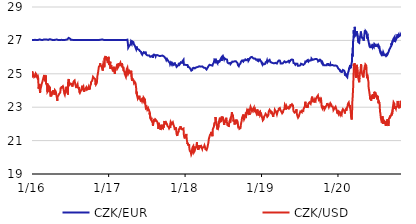
| Category | CZK/EUR | CZK/USD |
|---|---|---|
| 2016-01-04 | 27.02 | 24.794 |
| 2016-01-05 | 27.02 | 25.145 |
| 2016-01-06 | 27.025 | 25.196 |
| 2016-01-07 | 27.03 | 24.873 |
| 2016-01-08 | 27.02 | 24.873 |
| 2016-01-11 | 27.02 | 24.815 |
| 2016-01-12 | 27.02 | 24.937 |
| 2016-01-13 | 27.02 | 24.983 |
| 2016-01-14 | 27.02 | 24.804 |
| 2016-01-15 | 27.02 | 24.756 |
| 2016-01-18 | 27.035 | 24.821 |
| 2016-01-19 | 27.025 | 24.865 |
| 2016-01-20 | 27.04 | 24.789 |
| 2016-01-21 | 27.065 | 24.844 |
| 2016-01-22 | 27.025 | 25.002 |
| 2016-01-25 | 27.02 | 24.98 |
| 2016-01-26 | 27.02 | 24.928 |
| 2016-01-27 | 27.025 | 24.82 |
| 2016-01-28 | 27.02 | 24.78 |
| 2016-01-29 | 27.025 | 24.76 |
| 2016-02-01 | 27.02 | 24.823 |
| 2016-02-02 | 27.025 | 24.748 |
| 2016-02-03 | 27.02 | 24.72 |
| 2016-02-04 | 27.02 | 24.11 |
| 2016-02-05 | 27.035 | 24.134 |
| 2016-02-08 | 27.06 | 24.379 |
| 2016-02-09 | 27.06 | 24.09 |
| 2016-02-10 | 27.03 | 24.006 |
| 2016-02-11 | 27.07 | 23.857 |
| 2016-02-12 | 27.065 | 24.004 |
| 2016-02-15 | 27.035 | 24.182 |
| 2016-02-16 | 27.03 | 24.214 |
| 2016-02-17 | 27.03 | 24.276 |
| 2016-02-18 | 27.02 | 24.375 |
| 2016-02-19 | 27.025 | 24.351 |
| 2016-02-22 | 27.02 | 24.505 |
| 2016-02-23 | 27.03 | 24.57 |
| 2016-02-24 | 27.045 | 24.629 |
| 2016-02-25 | 27.05 | 24.526 |
| 2016-02-26 | 27.065 | 24.589 |
| 2016-02-29 | 27.055 | 24.848 |
| 2016-03-01 | 27.055 | 24.879 |
| 2016-03-02 | 27.045 | 24.933 |
| 2016-03-03 | 27.055 | 24.819 |
| 2016-03-04 | 27.06 | 24.661 |
| 2016-03-07 | 27.055 | 24.692 |
| 2016-03-08 | 27.06 | 24.541 |
| 2016-03-09 | 27.045 | 24.64 |
| 2016-03-10 | 27.035 | 24.899 |
| 2016-03-11 | 27.06 | 24.398 |
| 2016-03-14 | 27.05 | 24.324 |
| 2016-03-15 | 27.045 | 24.347 |
| 2016-03-16 | 27.05 | 24.45 |
| 2016-03-17 | 27.045 | 23.908 |
| 2016-03-18 | 27.035 | 23.966 |
| 2016-03-21 | 27.03 | 23.98 |
| 2016-03-22 | 27.035 | 24.117 |
| 2016-03-23 | 27.035 | 24.201 |
| 2016-03-24 | 27.065 | 24.267 |
| 2016-03-29 | 27.075 | 24.183 |
| 2016-03-30 | 27.075 | 23.896 |
| 2016-03-31 | 27.055 | 23.757 |
| 2016-04-01 | 27.03 | 23.64 |
| 2016-04-04 | 27.05 | 23.766 |
| 2016-04-05 | 27.035 | 23.774 |
| 2016-04-06 | 27.03 | 23.834 |
| 2016-04-07 | 27.025 | 23.775 |
| 2016-04-08 | 27.02 | 23.771 |
| 2016-04-11 | 27.025 | 23.724 |
| 2016-04-12 | 27.03 | 23.717 |
| 2016-04-13 | 27.035 | 23.923 |
| 2016-04-14 | 27.03 | 24.018 |
| 2016-04-15 | 27.025 | 23.948 |
| 2016-04-18 | 27.02 | 23.889 |
| 2016-04-19 | 27.02 | 23.821 |
| 2016-04-20 | 27.02 | 23.743 |
| 2016-04-21 | 27.025 | 23.798 |
| 2016-04-22 | 27.045 | 24.014 |
| 2016-04-25 | 27.045 | 24.014 |
| 2016-04-26 | 27.025 | 23.946 |
| 2016-04-27 | 27.035 | 23.916 |
| 2016-04-28 | 27.045 | 23.811 |
| 2016-04-29 | 27.04 | 23.714 |
| 2016-05-02 | 27.05 | 23.534 |
| 2016-05-03 | 27.035 | 23.383 |
| 2016-05-04 | 27.03 | 23.457 |
| 2016-05-05 | 27.03 | 23.628 |
| 2016-05-06 | 27.02 | 23.654 |
| 2016-05-09 | 27.02 | 23.717 |
| 2016-05-10 | 27.025 | 23.762 |
| 2016-05-11 | 27.02 | 23.681 |
| 2016-05-12 | 27.025 | 23.729 |
| 2016-05-13 | 27.02 | 23.81 |
| 2016-05-16 | 27.02 | 23.859 |
| 2016-05-17 | 27.02 | 23.873 |
| 2016-05-18 | 27.02 | 23.955 |
| 2016-05-19 | 27.02 | 24.133 |
| 2016-05-20 | 27.025 | 24.083 |
| 2016-05-23 | 27.035 | 24.106 |
| 2016-05-24 | 27.025 | 24.192 |
| 2016-05-25 | 27.03 | 24.253 |
| 2016-05-26 | 27.025 | 24.192 |
| 2016-05-27 | 27.03 | 24.203 |
| 2016-05-30 | 27.02 | 24.255 |
| 2016-05-31 | 27.02 | 24.223 |
| 2016-06-01 | 27.025 | 24.186 |
| 2016-06-02 | 27.03 | 24.167 |
| 2016-06-03 | 27.025 | 24.221 |
| 2016-06-06 | 27.025 | 23.805 |
| 2016-06-07 | 27.02 | 23.815 |
| 2016-06-08 | 27.02 | 23.743 |
| 2016-06-09 | 27.02 | 23.815 |
| 2016-06-10 | 27.025 | 23.905 |
| 2016-06-13 | 27.035 | 23.997 |
| 2016-06-14 | 27.045 | 24.088 |
| 2016-06-15 | 27.075 | 24.103 |
| 2016-06-16 | 27.065 | 24.224 |
| 2016-06-17 | 27.07 | 24.052 |
| 2016-06-20 | 27.06 | 23.877 |
| 2016-06-21 | 27.065 | 23.923 |
| 2016-06-22 | 27.07 | 23.976 |
| 2016-06-23 | 27.06 | 23.761 |
| 2016-06-24 | 27.1 | 24.491 |
| 2016-06-27 | 27.15 | 24.692 |
| 2016-06-28 | 27.11 | 24.484 |
| 2016-06-29 | 27.115 | 24.443 |
| 2016-06-30 | 27.13 | 24.433 |
| 2016-07-01 | 27.095 | 24.335 |
| 2016-07-04 | 27.095 | 24.322 |
| 2016-07-07 | 27.05 | 24.417 |
| 2016-07-08 | 27.03 | 24.421 |
| 2016-07-11 | 27.035 | 24.458 |
| 2016-07-12 | 27.035 | 24.367 |
| 2016-07-13 | 27.035 | 24.415 |
| 2016-07-14 | 27.04 | 24.235 |
| 2016-07-15 | 27.03 | 24.284 |
| 2016-07-18 | 27.025 | 24.446 |
| 2016-07-19 | 27.025 | 24.488 |
| 2016-07-20 | 27.02 | 24.532 |
| 2016-07-21 | 27.025 | 24.53 |
| 2016-07-22 | 27.025 | 24.535 |
| 2016-07-25 | 27.02 | 24.601 |
| 2016-07-26 | 27.025 | 24.573 |
| 2016-07-27 | 27.035 | 24.594 |
| 2016-07-28 | 27.045 | 24.382 |
| 2016-07-29 | 27.03 | 24.324 |
| 2016-08-01 | 27.03 | 24.212 |
| 2016-08-02 | 27.03 | 24.147 |
| 2016-08-03 | 27.035 | 24.143 |
| 2016-08-04 | 27.03 | 24.273 |
| 2016-08-05 | 27.02 | 24.219 |
| 2016-08-08 | 27.03 | 24.38 |
| 2016-08-09 | 27.025 | 24.392 |
| 2016-08-10 | 27.025 | 24.17 |
| 2016-08-11 | 27.02 | 24.224 |
| 2016-08-12 | 27.02 | 24.211 |
| 2016-08-15 | 27.02 | 24.162 |
| 2016-08-16 | 27.02 | 23.918 |
| 2016-08-17 | 27.025 | 23.973 |
| 2016-08-18 | 27.025 | 23.865 |
| 2016-08-19 | 27.02 | 23.851 |
| 2016-08-22 | 27.025 | 23.901 |
| 2016-08-23 | 27.025 | 23.832 |
| 2016-08-24 | 27.025 | 23.984 |
| 2016-08-25 | 27.03 | 23.938 |
| 2016-08-26 | 27.02 | 23.928 |
| 2016-08-29 | 27.02 | 24.192 |
| 2016-08-30 | 27.025 | 24.196 |
| 2016-08-31 | 27.03 | 24.286 |
| 2016-09-01 | 27.025 | 24.252 |
| 2016-09-02 | 27.02 | 24.138 |
| 2016-09-05 | 27.02 | 24.218 |
| 2016-09-06 | 27.02 | 24.211 |
| 2016-09-07 | 27.02 | 24.041 |
| 2016-09-08 | 27.02 | 23.921 |
| 2016-09-09 | 27.02 | 23.975 |
| 2016-09-12 | 27.025 | 24.074 |
| 2016-09-13 | 27.02 | 24.031 |
| 2016-09-14 | 27.025 | 24.083 |
| 2016-09-15 | 27.025 | 24.017 |
| 2016-09-16 | 27.025 | 24.073 |
| 2016-09-19 | 27.02 | 24.197 |
| 2016-09-20 | 27.02 | 24.16 |
| 2016-09-21 | 27.02 | 24.232 |
| 2016-09-22 | 27.02 | 24.046 |
| 2016-09-23 | 27.02 | 24.096 |
| 2016-09-26 | 27.02 | 23.992 |
| 2016-09-27 | 27.025 | 24.088 |
| 2016-09-29 | 27.02 | 24.076 |
| 2016-09-30 | 27.02 | 24.21 |
| 2016-10-03 | 27.02 | 24.049 |
| 2016-10-04 | 27.02 | 24.207 |
| 2016-10-05 | 27.02 | 24.085 |
| 2016-10-06 | 27.02 | 24.156 |
| 2016-10-07 | 27.02 | 24.249 |
| 2016-10-10 | 27.02 | 24.209 |
| 2016-10-11 | 27.02 | 24.387 |
| 2016-10-12 | 27.025 | 24.521 |
| 2016-10-13 | 27.02 | 24.478 |
| 2016-10-14 | 27.025 | 24.561 |
| 2016-10-17 | 27.025 | 24.584 |
| 2016-10-18 | 27.02 | 24.578 |
| 2016-10-19 | 27.02 | 24.611 |
| 2016-10-20 | 27.02 | 24.603 |
| 2016-10-21 | 27.02 | 24.82 |
| 2016-10-24 | 27.02 | 24.809 |
| 2016-10-25 | 27.02 | 24.846 |
| 2016-10-26 | 27.02 | 24.736 |
| 2016-10-27 | 27.02 | 24.729 |
| 2016-10-31 | 27.025 | 24.687 |
| 2016-11-01 | 27.025 | 24.508 |
| 2016-11-02 | 27.02 | 24.356 |
| 2016-11-03 | 27.02 | 24.426 |
| 2016-11-04 | 27.02 | 24.359 |
| 2016-11-07 | 27.02 | 24.424 |
| 2016-11-08 | 27.02 | 24.478 |
| 2016-11-09 | 27.025 | 24.521 |
| 2016-11-10 | 27.02 | 24.804 |
| 2016-11-11 | 27.055 | 24.802 |
| 2016-11-14 | 27.025 | 25.08 |
| 2016-11-15 | 27.03 | 25.106 |
| 2016-11-16 | 27.035 | 25.257 |
| 2016-11-18 | 27.035 | 25.436 |
| 2016-11-21 | 27.03 | 25.424 |
| 2016-11-22 | 27.045 | 25.474 |
| 2016-11-23 | 27.025 | 25.488 |
| 2016-11-24 | 27.035 | 25.629 |
| 2016-11-25 | 27.04 | 25.532 |
| 2016-11-28 | 27.045 | 25.538 |
| 2016-11-29 | 27.05 | 25.574 |
| 2016-11-30 | 27.06 | 25.455 |
| 2016-12-01 | 27.06 | 25.465 |
| 2016-12-02 | 27.06 | 25.426 |
| 2016-12-05 | 27.055 | 25.276 |
| 2016-12-06 | 27.045 | 25.191 |
| 2016-12-07 | 27.035 | 25.195 |
| 2016-12-08 | 27.04 | 25.134 |
| 2016-12-09 | 27.025 | 25.588 |
| 2016-12-12 | 27.025 | 25.511 |
| 2016-12-13 | 27.02 | 25.461 |
| 2016-12-14 | 27.025 | 25.386 |
| 2016-12-15 | 27.02 | 25.932 |
| 2016-12-16 | 27.02 | 25.882 |
| 2016-12-19 | 27.02 | 25.926 |
| 2016-12-20 | 27.02 | 26.068 |
| 2016-12-21 | 27.02 | 25.927 |
| 2016-12-22 | 27.02 | 25.869 |
| 2016-12-23 | 27.02 | 25.865 |
| 2016-12-27 | 27.02 | 25.866 |
| 2016-12-28 | 27.04 | 26 |
| 2016-12-29 | 27.02 | 25.849 |
| 2016-12-30 | 27.02 | 25.639 |
| 2017-01-02 | 27.02 | 25.819 |
| 2017-01-03 | 27.02 | 26.017 |
| 2017-01-04 | 27.02 | 25.889 |
| 2017-01-05 | 27.02 | 25.714 |
| 2017-01-06 | 27.02 | 25.516 |
| 2017-01-09 | 27.02 | 25.697 |
| 2017-01-10 | 27.02 | 25.571 |
| 2017-01-11 | 27.02 | 25.721 |
| 2017-01-12 | 27.02 | 25.3 |
| 2017-01-13 | 27.02 | 25.347 |
| 2017-01-16 | 27.02 | 25.503 |
| 2017-01-17 | 27.02 | 25.291 |
| 2017-01-18 | 27.02 | 25.335 |
| 2017-01-19 | 27.02 | 25.329 |
| 2017-01-20 | 27.02 | 25.414 |
| 2017-01-23 | 27.025 | 25.22 |
| 2017-01-24 | 27.02 | 25.141 |
| 2017-01-25 | 27.02 | 25.144 |
| 2017-01-26 | 27.02 | 25.252 |
| 2017-01-27 | 27.02 | 25.297 |
| 2017-01-30 | 27.02 | 25.421 |
| 2017-01-31 | 27.02 | 25.12 |
| 2017-02-01 | 27.02 | 25.074 |
| 2017-02-02 | 27.02 | 24.992 |
| 2017-02-03 | 27.02 | 25.155 |
| 2017-02-06 | 27.02 | 25.219 |
| 2017-02-07 | 27.02 | 25.306 |
| 2017-02-08 | 27.02 | 25.333 |
| 2017-02-09 | 27.02 | 25.268 |
| 2017-02-10 | 27.02 | 25.422 |
| 2017-02-13 | 27.02 | 25.421 |
| 2017-02-14 | 27.02 | 25.437 |
| 2017-02-15 | 27.02 | 25.596 |
| 2017-02-16 | 27.02 | 25.36 |
| 2017-02-17 | 27.02 | 25.372 |
| 2017-02-20 | 27.02 | 25.449 |
| 2017-02-21 | 27.02 | 25.644 |
| 2017-02-22 | 27.02 | 25.7 |
| 2017-02-23 | 27.02 | 25.556 |
| 2017-02-24 | 27.02 | 25.468 |
| 2017-02-27 | 27.02 | 25.522 |
| 2017-02-28 | 27.02 | 25.497 |
| 2017-03-01 | 27.02 | 25.654 |
| 2017-03-02 | 27.02 | 25.695 |
| 2017-03-03 | 27.02 | 25.574 |
| 2017-03-06 | 27.02 | 25.506 |
| 2017-03-07 | 27.02 | 25.547 |
| 2017-03-08 | 27.02 | 25.631 |
| 2017-03-09 | 27.02 | 25.613 |
| 2017-03-10 | 27.02 | 25.482 |
| 2017-03-13 | 27.02 | 25.339 |
| 2017-03-14 | 27.02 | 25.415 |
| 2017-03-15 | 27.02 | 25.434 |
| 2017-03-16 | 27.02 | 25.195 |
| 2017-03-17 | 27.02 | 25.154 |
| 2017-03-20 | 27.02 | 25.129 |
| 2017-03-21 | 27.02 | 25.009 |
| 2017-03-22 | 27.02 | 25.003 |
| 2017-03-23 | 27.02 | 25.05 |
| 2017-03-24 | 27.02 | 25.008 |
| 2017-03-27 | 27.02 | 24.813 |
| 2017-03-28 | 27.02 | 24.883 |
| 2017-03-29 | 27.02 | 25.14 |
| 2017-03-30 | 27.02 | 25.159 |
| 2017-03-31 | 27.03 | 25.282 |
| 2017-04-03 | 27.045 | 25.367 |
| 2017-04-04 | 27.055 | 25.404 |
| 2017-04-05 | 27.06 | 25.37 |
| 2017-04-06 | 26.75 | 25.076 |
| 2017-04-07 | 26.565 | 24.999 |
| 2017-04-10 | 26.53 | 25.082 |
| 2017-04-11 | 26.66 | 25.112 |
| 2017-04-12 | 26.695 | 25.172 |
| 2017-04-13 | 26.705 | 25.122 |
| 2017-04-18 | 26.76 | 25.053 |
| 2017-04-19 | 26.795 | 24.985 |
| 2017-04-20 | 26.91 | 25.043 |
| 2017-04-21 | 26.935 | 25.179 |
| 2017-04-24 | 26.795 | 24.706 |
| 2017-04-25 | 26.77 | 24.58 |
| 2017-04-26 | 26.945 | 24.735 |
| 2017-04-27 | 26.935 | 24.752 |
| 2017-04-28 | 26.92 | 24.629 |
| 2017-05-02 | 26.89 | 24.639 |
| 2017-05-03 | 26.87 | 24.607 |
| 2017-05-04 | 26.77 | 24.499 |
| 2017-05-05 | 26.78 | 24.433 |
| 2017-05-09 | 26.67 | 24.497 |
| 2017-05-10 | 26.64 | 24.486 |
| 2017-05-11 | 26.6 | 24.495 |
| 2017-05-12 | 26.575 | 24.435 |
| 2017-05-15 | 26.47 | 24.124 |
| 2017-05-16 | 26.42 | 23.888 |
| 2017-05-17 | 26.435 | 23.778 |
| 2017-05-18 | 26.63 | 23.927 |
| 2017-05-19 | 26.5 | 23.71 |
| 2017-05-22 | 26.485 | 23.557 |
| 2017-05-23 | 26.48 | 23.615 |
| 2017-05-24 | 26.465 | 23.642 |
| 2017-05-25 | 26.41 | 23.552 |
| 2017-05-26 | 26.435 | 23.606 |
| 2017-05-29 | 26.435 | 23.627 |
| 2017-05-30 | 26.465 | 23.69 |
| 2017-05-31 | 26.42 | 23.545 |
| 2017-06-01 | 26.395 | 23.554 |
| 2017-06-02 | 26.36 | 23.501 |
| 2017-06-05 | 26.325 | 23.401 |
| 2017-06-06 | 26.335 | 23.393 |
| 2017-06-07 | 26.315 | 23.459 |
| 2017-06-08 | 26.27 | 23.392 |
| 2017-06-09 | 26.22 | 23.463 |
| 2017-06-12 | 26.2 | 23.348 |
| 2017-06-13 | 26.145 | 23.308 |
| 2017-06-14 | 26.165 | 23.354 |
| 2017-06-15 | 26.21 | 23.468 |
| 2017-06-16 | 26.23 | 23.49 |
| 2017-06-19 | 26.17 | 23.369 |
| 2017-06-20 | 26.295 | 23.568 |
| 2017-06-21 | 26.265 | 23.565 |
| 2017-06-22 | 26.27 | 23.522 |
| 2017-06-23 | 26.295 | 23.53 |
| 2017-06-26 | 26.24 | 23.457 |
| 2017-06-27 | 26.27 | 23.29 |
| 2017-06-28 | 26.325 | 23.141 |
| 2017-06-29 | 26.285 | 23.032 |
| 2017-06-30 | 26.195 | 22.952 |
| 2017-07-03 | 26.14 | 22.993 |
| 2017-07-04 | 26.13 | 23.017 |
| 2017-07-07 | 26.08 | 22.852 |
| 2017-07-10 | 26.095 | 22.917 |
| 2017-07-11 | 26.125 | 22.907 |
| 2017-07-12 | 26.11 | 22.804 |
| 2017-07-13 | 26.12 | 22.878 |
| 2017-07-14 | 26.075 | 22.842 |
| 2017-07-17 | 26.09 | 22.762 |
| 2017-07-18 | 26.08 | 22.57 |
| 2017-07-19 | 26.035 | 22.572 |
| 2017-07-20 | 26.04 | 22.671 |
| 2017-07-21 | 26.02 | 22.347 |
| 2017-07-24 | 26.025 | 22.344 |
| 2017-07-25 | 26.02 | 22.25 |
| 2017-07-26 | 26.045 | 22.371 |
| 2017-07-27 | 26.045 | 22.269 |
| 2017-07-28 | 26.05 | 22.209 |
| 2017-07-31 | 26.08 | 22.24 |
| 2017-08-01 | 26.13 | 22.123 |
| 2017-08-02 | 26.125 | 22.099 |
| 2017-08-03 | 25.965 | 21.89 |
| 2017-08-04 | 26.065 | 21.961 |
| 2017-08-07 | 26.115 | 22.135 |
| 2017-08-08 | 26.15 | 22.134 |
| 2017-08-09 | 26.16 | 22.301 |
| 2017-08-10 | 26.16 | 22.297 |
| 2017-08-11 | 26.155 | 22.232 |
| 2017-08-14 | 26.12 | 22.143 |
| 2017-08-15 | 26.14 | 22.26 |
| 2017-08-16 | 26.045 | 22.243 |
| 2017-08-17 | 26.01 | 22.24 |
| 2017-08-18 | 26.11 | 22.243 |
| 2017-08-21 | 26.085 | 22.177 |
| 2017-08-22 | 26.085 | 22.16 |
| 2017-08-23 | 26.125 | 22.14 |
| 2017-08-24 | 26.1 | 22.106 |
| 2017-08-25 | 26.085 | 22.098 |
| 2017-08-28 | 26.1 | 21.887 |
| 2017-08-29 | 26.14 | 21.697 |
| 2017-08-30 | 26.045 | 21.849 |
| 2017-08-31 | 26.105 | 22.073 |
| 2017-09-01 | 26.075 | 21.871 |
| 2017-09-04 | 26.06 | 21.895 |
| 2017-09-05 | 26.075 | 21.928 |
| 2017-09-06 | 26.11 | 21.88 |
| 2017-09-07 | 26.11 | 21.801 |
| 2017-09-08 | 26.1 | 21.641 |
| 2017-09-11 | 26.075 | 21.736 |
| 2017-09-12 | 26.105 | 21.87 |
| 2017-09-13 | 26.1 | 21.787 |
| 2017-09-14 | 26.1 | 21.953 |
| 2017-09-15 | 26.08 | 21.794 |
| 2017-09-18 | 26.09 | 21.836 |
| 2017-09-19 | 26.105 | 21.809 |
| 2017-09-20 | 26.09 | 21.734 |
| 2017-09-21 | 26.085 | 21.891 |
| 2017-09-22 | 26.045 | 21.771 |
| 2017-09-25 | 26.035 | 21.937 |
| 2017-09-26 | 26.055 | 22.103 |
| 2017-09-27 | 26.035 | 22.176 |
| 2017-09-29 | 25.975 | 22.003 |
| 2017-10-02 | 25.995 | 22.135 |
| 2017-10-03 | 25.93 | 22.065 |
| 2017-10-04 | 25.885 | 21.97 |
| 2017-10-05 | 25.835 | 22.003 |
| 2017-10-06 | 25.815 | 22.05 |
| 2017-10-09 | 25.89 | 22.044 |
| 2017-10-10 | 25.9 | 21.96 |
| 2017-10-11 | 25.88 | 21.878 |
| 2017-10-12 | 25.89 | 21.837 |
| 2017-10-13 | 25.81 | 21.852 |
| 2017-10-16 | 25.765 | 21.828 |
| 2017-10-17 | 25.735 | 21.885 |
| 2017-10-18 | 25.705 | 21.881 |
| 2017-10-19 | 25.725 | 21.736 |
| 2017-10-20 | 25.69 | 21.739 |
| 2017-10-23 | 25.64 | 21.84 |
| 2017-10-24 | 25.58 | 21.753 |
| 2017-10-25 | 25.59 | 21.715 |
| 2017-10-26 | 25.585 | 21.779 |
| 2017-10-27 | 25.67 | 22.117 |
| 2017-10-30 | 25.645 | 22.086 |
| 2017-10-31 | 25.67 | 22.06 |
| 2017-11-01 | 25.555 | 22.008 |
| 2017-11-02 | 25.56 | 21.949 |
| 2017-11-03 | 25.65 | 22.006 |
| 2017-11-06 | 25.61 | 22.098 |
| 2017-11-07 | 25.59 | 22.132 |
| 2017-11-08 | 25.56 | 22.053 |
| 2017-11-09 | 25.53 | 21.954 |
| 2017-11-10 | 25.545 | 21.923 |
| 2017-11-13 | 25.565 | 21.929 |
| 2017-11-14 | 25.565 | 21.766 |
| 2017-11-15 | 25.67 | 21.684 |
| 2017-11-16 | 25.56 | 21.712 |
| 2017-11-20 | 25.565 | 21.701 |
| 2017-11-21 | 25.53 | 21.791 |
| 2017-11-22 | 25.47 | 21.677 |
| 2017-11-23 | 25.46 | 21.487 |
| 2017-11-24 | 25.41 | 21.392 |
| 2017-11-27 | 25.43 | 21.279 |
| 2017-11-28 | 25.46 | 21.418 |
| 2017-11-29 | 25.475 | 21.542 |
| 2017-11-30 | 25.495 | 21.519 |
| 2017-12-01 | 25.525 | 21.475 |
| 2017-12-04 | 25.56 | 21.541 |
| 2017-12-05 | 25.655 | 21.656 |
| 2017-12-06 | 25.635 | 21.695 |
| 2017-12-07 | 25.61 | 21.727 |
| 2017-12-08 | 25.555 | 21.765 |
| 2017-12-11 | 25.6 | 21.705 |
| 2017-12-12 | 25.625 | 21.776 |
| 2017-12-13 | 25.65 | 21.86 |
| 2017-12-14 | 25.685 | 21.682 |
| 2017-12-15 | 25.68 | 21.75 |
| 2017-12-18 | 25.685 | 21.775 |
| 2017-12-19 | 25.66 | 21.702 |
| 2017-12-20 | 25.675 | 21.677 |
| 2017-12-21 | 25.715 | 21.684 |
| 2017-12-22 | 25.75 | 21.725 |
| 2017-12-27 | 25.84 | 21.723 |
| 2017-12-28 | 25.645 | 21.489 |
| 2017-12-29 | 25.54 | 21.291 |
| 2018-01-02 | 25.495 | 21.13 |
| 2018-01-03 | 25.545 | 21.238 |
| 2018-01-04 | 25.51 | 21.16 |
| 2018-01-05 | 25.595 | 21.248 |
| 2018-01-08 | 25.525 | 21.324 |
| 2018-01-09 | 25.535 | 21.399 |
| 2018-01-10 | 25.565 | 21.315 |
| 2018-01-11 | 25.545 | 21.256 |
| 2018-01-12 | 25.52 | 21.025 |
| 2018-01-15 | 25.53 | 20.796 |
| 2018-01-16 | 25.515 | 20.863 |
| 2018-01-17 | 25.445 | 20.852 |
| 2018-01-18 | 25.37 | 20.742 |
| 2018-01-19 | 25.43 | 20.749 |
| 2018-01-22 | 25.4 | 20.752 |
| 2018-01-23 | 25.405 | 20.742 |
| 2018-01-24 | 25.375 | 20.543 |
| 2018-01-25 | 25.38 | 20.454 |
| 2018-01-26 | 25.355 | 20.392 |
| 2018-01-29 | 25.295 | 20.432 |
| 2018-01-30 | 25.33 | 20.394 |
| 2018-01-31 | 25.27 | 20.291 |
| 2018-02-01 | 25.265 | 20.281 |
| 2018-02-02 | 25.19 | 20.163 |
| 2018-02-05 | 25.2 | 20.256 |
| 2018-02-06 | 25.23 | 20.464 |
| 2018-02-07 | 25.23 | 20.448 |
| 2018-02-08 | 25.245 | 20.595 |
| 2018-02-09 | 25.335 | 20.645 |
| 2018-02-12 | 25.355 | 20.677 |
| 2018-02-13 | 25.385 | 20.583 |
| 2018-02-14 | 25.36 | 20.539 |
| 2018-02-15 | 25.37 | 20.307 |
| 2018-02-16 | 25.34 | 20.327 |
| 2018-02-19 | 25.325 | 20.406 |
| 2018-02-20 | 25.315 | 20.515 |
| 2018-02-21 | 25.36 | 20.604 |
| 2018-02-22 | 25.315 | 20.623 |
| 2018-02-23 | 25.335 | 20.603 |
| 2018-02-26 | 25.39 | 20.608 |
| 2018-02-27 | 25.405 | 20.652 |
| 2018-02-28 | 25.42 | 20.816 |
| 2018-03-01 | 25.435 | 20.898 |
| 2018-03-02 | 25.41 | 20.638 |
| 2018-03-05 | 25.405 | 20.642 |
| 2018-03-06 | 25.38 | 20.45 |
| 2018-03-07 | 25.415 | 20.47 |
| 2018-03-08 | 25.43 | 20.472 |
| 2018-03-09 | 25.455 | 20.717 |
| 2018-03-12 | 25.45 | 20.688 |
| 2018-03-13 | 25.47 | 20.577 |
| 2018-03-14 | 25.445 | 20.573 |
| 2018-03-15 | 25.415 | 20.594 |
| 2018-03-16 | 25.415 | 20.666 |
| 2018-03-19 | 25.43 | 20.661 |
| 2018-03-20 | 25.42 | 20.707 |
| 2018-03-21 | 25.42 | 20.689 |
| 2018-03-22 | 25.4 | 20.624 |
| 2018-03-23 | 25.405 | 20.586 |
| 2018-03-26 | 25.445 | 20.506 |
| 2018-03-27 | 25.475 | 20.586 |
| 2018-03-28 | 25.46 | 20.533 |
| 2018-03-29 | 25.43 | 20.641 |
| 2018-04-03 | 25.365 | 20.608 |
| 2018-04-04 | 25.34 | 20.645 |
| 2018-04-05 | 25.325 | 20.655 |
| 2018-04-06 | 25.34 | 20.714 |
| 2018-04-09 | 25.355 | 20.608 |
| 2018-04-10 | 25.335 | 20.497 |
| 2018-04-11 | 25.325 | 20.449 |
| 2018-04-12 | 25.315 | 20.548 |
| 2018-04-13 | 25.305 | 20.545 |
| 2018-04-16 | 25.26 | 20.435 |
| 2018-04-17 | 25.255 | 20.439 |
| 2018-04-18 | 25.3 | 20.424 |
| 2018-04-19 | 25.325 | 20.454 |
| 2018-04-20 | 25.34 | 20.584 |
| 2018-04-23 | 25.41 | 20.763 |
| 2018-04-24 | 25.435 | 20.827 |
| 2018-04-25 | 25.465 | 20.899 |
| 2018-04-26 | 25.475 | 20.944 |
| 2018-04-27 | 25.47 | 21.102 |
| 2018-04-30 | 25.54 | 21.144 |
| 2018-05-02 | 25.595 | 21.319 |
| 2018-05-03 | 25.58 | 21.332 |
| 2018-05-04 | 25.505 | 21.31 |
| 2018-05-07 | 25.515 | 21.438 |
| 2018-05-09 | 25.565 | 21.525 |
| 2018-05-10 | 25.495 | 21.465 |
| 2018-05-11 | 25.505 | 21.37 |
| 2018-05-14 | 25.49 | 21.264 |
| 2018-05-15 | 25.55 | 21.501 |
| 2018-05-16 | 25.545 | 21.679 |
| 2018-05-17 | 25.56 | 21.646 |
| 2018-05-18 | 25.59 | 21.718 |
| 2018-05-21 | 25.68 | 21.84 |
| 2018-05-22 | 25.7 | 21.791 |
| 2018-05-23 | 25.815 | 22.041 |
| 2018-05-24 | 25.81 | 22.011 |
| 2018-05-25 | 25.765 | 22.07 |
| 2018-05-28 | 25.73 | 22.095 |
| 2018-05-29 | 25.905 | 22.413 |
| 2018-05-30 | 25.835 | 22.202 |
| 2018-05-31 | 25.79 | 22.05 |
| 2018-06-01 | 25.83 | 22.137 |
| 2018-06-04 | 25.7 | 21.897 |
| 2018-06-05 | 25.65 | 21.971 |
| 2018-06-06 | 25.645 | 21.798 |
| 2018-06-07 | 25.64 | 21.662 |
| 2018-06-08 | 25.795 | 21.944 |
| 2018-06-11 | 25.68 | 21.781 |
| 2018-06-12 | 25.65 | 21.757 |
| 2018-06-13 | 25.71 | 21.856 |
| 2018-06-14 | 25.65 | 21.866 |
| 2018-06-15 | 25.71 | 22.171 |
| 2018-06-18 | 25.74 | 22.165 |
| 2018-06-19 | 25.81 | 22.373 |
| 2018-06-20 | 25.835 | 22.316 |
| 2018-06-21 | 25.865 | 22.413 |
| 2018-06-22 | 25.79 | 22.139 |
| 2018-06-25 | 25.935 | 22.172 |
| 2018-06-26 | 25.9 | 22.188 |
| 2018-06-27 | 25.77 | 22.184 |
| 2018-06-28 | 26 | 22.448 |
| 2018-06-29 | 26.02 | 22.318 |
| 2018-07-02 | 26 | 22.343 |
| 2018-07-03 | 26.075 | 22.356 |
| 2018-07-04 | 26.03 | 22.357 |
| 2018-07-09 | 25.86 | 21.934 |
| 2018-07-10 | 25.9 | 22.113 |
| 2018-07-11 | 25.93 | 22.099 |
| 2018-07-12 | 25.94 | 22.25 |
| 2018-07-13 | 25.92 | 22.262 |
| 2018-07-16 | 25.88 | 22.082 |
| 2018-07-17 | 25.875 | 22.1 |
| 2018-07-18 | 25.855 | 22.268 |
| 2018-07-19 | 25.92 | 22.368 |
| 2018-07-20 | 25.875 | 22.175 |
| 2018-07-23 | 25.85 | 22.065 |
| 2018-07-24 | 25.76 | 22.006 |
| 2018-07-25 | 25.675 | 21.965 |
| 2018-07-26 | 25.645 | 21.891 |
| 2018-07-27 | 25.62 | 22.039 |
| 2018-07-30 | 25.625 | 21.931 |
| 2018-07-31 | 25.6 | 21.814 |
| 2018-08-01 | 25.59 | 21.889 |
| 2018-08-02 | 25.6 | 22.04 |
| 2018-08-03 | 25.66 | 22.144 |
| 2018-08-06 | 25.65 | 22.221 |
| 2018-08-07 | 25.605 | 22.072 |
| 2018-08-08 | 25.58 | 22.076 |
| 2018-08-09 | 25.57 | 22.057 |
| 2018-08-10 | 25.635 | 22.377 |
| 2018-08-13 | 25.66 | 22.503 |
| 2018-08-14 | 25.69 | 22.524 |
| 2018-08-15 | 25.71 | 22.709 |
| 2018-08-16 | 25.7 | 22.606 |
| 2018-08-17 | 25.73 | 22.583 |
| 2018-08-20 | 25.705 | 22.509 |
| 2018-08-21 | 25.74 | 22.376 |
| 2018-08-22 | 25.725 | 22.149 |
| 2018-08-23 | 25.71 | 22.207 |
| 2018-08-24 | 25.745 | 22.218 |
| 2018-08-27 | 25.745 | 22.127 |
| 2018-08-28 | 25.72 | 21.963 |
| 2018-08-29 | 25.745 | 22.08 |
| 2018-08-30 | 25.75 | 22.025 |
| 2018-08-31 | 25.735 | 22.089 |
| 2018-09-03 | 25.75 | 22.183 |
| 2018-09-04 | 25.73 | 22.256 |
| 2018-09-05 | 25.745 | 22.238 |
| 2018-09-06 | 25.715 | 22.09 |
| 2018-09-07 | 25.695 | 22.124 |
| 2018-09-10 | 25.65 | 22.166 |
| 2018-09-11 | 25.65 | 22.157 |
| 2018-09-12 | 25.59 | 22.096 |
| 2018-09-13 | 25.52 | 21.965 |
| 2018-09-14 | 25.475 | 21.79 |
| 2018-09-17 | 25.455 | 21.811 |
| 2018-09-18 | 25.45 | 21.761 |
| 2018-09-19 | 25.43 | 21.796 |
| 2018-09-20 | 25.56 | 21.71 |
| 2018-09-21 | 25.585 | 21.756 |
| 2018-09-24 | 25.615 | 21.763 |
| 2018-09-25 | 25.615 | 21.752 |
| 2018-09-26 | 25.605 | 21.819 |
| 2018-09-27 | 25.715 | 21.967 |
| 2018-10-01 | 25.765 | 22.201 |
| 2018-10-02 | 25.79 | 22.343 |
| 2018-10-03 | 25.78 | 22.329 |
| 2018-10-04 | 25.78 | 22.415 |
| 2018-10-05 | 25.74 | 22.372 |
| 2018-10-08 | 25.735 | 22.426 |
| 2018-10-09 | 25.805 | 22.564 |
| 2018-10-10 | 25.805 | 22.44 |
| 2018-10-11 | 25.85 | 22.335 |
| 2018-10-12 | 25.775 | 22.269 |
| 2018-10-15 | 25.8 | 22.277 |
| 2018-10-16 | 25.815 | 22.283 |
| 2018-10-17 | 25.845 | 22.418 |
| 2018-10-18 | 25.86 | 22.476 |
| 2018-10-19 | 25.865 | 22.552 |
| 2018-10-22 | 25.84 | 22.483 |
| 2018-10-23 | 25.815 | 22.49 |
| 2018-10-24 | 25.83 | 22.685 |
| 2018-10-25 | 25.83 | 22.627 |
| 2018-10-26 | 25.86 | 22.797 |
| 2018-10-29 | 25.85 | 22.715 |
| 2018-10-30 | 25.87 | 22.75 |
| 2018-10-31 | 25.92 | 22.902 |
| 2018-11-01 | 25.875 | 22.712 |
| 2018-11-02 | 25.78 | 22.581 |
| 2018-11-05 | 25.845 | 22.73 |
| 2018-11-06 | 25.835 | 22.606 |
| 2018-11-07 | 25.88 | 22.531 |
| 2018-11-08 | 25.885 | 22.653 |
| 2018-11-09 | 25.935 | 22.857 |
| 2018-11-12 | 25.94 | 23.029 |
| 2018-11-13 | 25.94 | 23.032 |
| 2018-11-14 | 25.995 | 23.013 |
| 2018-11-15 | 25.985 | 22.992 |
| 2018-11-16 | 25.985 | 22.903 |
| 2018-11-19 | 26.01 | 22.761 |
| 2018-11-20 | 26.03 | 22.794 |
| 2018-11-21 | 26 | 22.788 |
| 2018-11-22 | 25.99 | 22.79 |
| 2018-11-23 | 25.955 | 22.866 |
| 2018-11-26 | 25.92 | 22.808 |
| 2018-11-27 | 25.915 | 22.874 |
| 2018-11-28 | 25.93 | 22.977 |
| 2018-11-29 | 25.965 | 22.802 |
| 2018-11-30 | 25.955 | 22.848 |
| 2018-12-03 | 25.92 | 22.874 |
| 2018-12-04 | 25.9 | 22.702 |
| 2018-12-05 | 25.885 | 22.802 |
| 2018-12-06 | 25.89 | 22.796 |
| 2018-12-07 | 25.85 | 22.736 |
| 2018-12-10 | 25.865 | 22.64 |
| 2018-12-11 | 25.845 | 22.711 |
| 2018-12-12 | 25.865 | 22.796 |
| 2018-12-13 | 25.83 | 22.716 |
| 2018-12-14 | 25.795 | 22.858 |
| 2018-12-17 | 25.8 | 22.749 |
| 2018-12-18 | 25.755 | 22.638 |
| 2018-12-19 | 25.76 | 22.591 |
| 2018-12-20 | 25.76 | 22.497 |
| 2018-12-21 | 25.855 | 22.654 |
| 2018-12-27 | 25.86 | 22.733 |
| 2018-12-28 | 25.78 | 22.506 |
| 2018-12-31 | 25.725 | 22.466 |
| 2019-01-02 | 25.75 | 22.594 |
| 2019-01-03 | 25.68 | 22.634 |
| 2019-01-04 | 25.65 | 22.494 |
| 2019-01-07 | 25.575 | 22.347 |
| 2019-01-08 | 25.64 | 22.416 |
| 2019-01-09 | 25.63 | 22.376 |
| 2019-01-10 | 25.625 | 22.221 |
| 2019-01-11 | 25.605 | 22.199 |
| 2019-01-14 | 25.56 | 22.29 |
| 2019-01-15 | 25.57 | 22.382 |
| 2019-01-16 | 25.565 | 22.446 |
| 2019-01-17 | 25.535 | 22.407 |
| 2019-01-18 | 25.58 | 22.432 |
| 2019-01-21 | 25.595 | 22.528 |
| 2019-01-22 | 25.61 | 22.559 |
| 2019-01-23 | 25.695 | 22.605 |
| 2019-01-24 | 25.695 | 22.659 |
| 2019-01-25 | 25.695 | 22.644 |
| 2019-01-28 | 25.725 | 22.529 |
| 2019-01-29 | 25.745 | 22.541 |
| 2019-01-30 | 25.8 | 22.579 |
| 2019-01-31 | 25.76 | 22.427 |
| 2019-02-01 | 25.695 | 22.398 |
| 2019-02-04 | 25.73 | 22.48 |
| 2019-02-05 | 25.7 | 22.508 |
| 2019-02-06 | 25.785 | 22.629 |
| 2019-02-07 | 25.805 | 22.747 |
| 2019-02-08 | 25.805 | 22.745 |
| 2019-02-11 | 25.835 | 22.845 |
| 2019-02-12 | 25.87 | 22.901 |
| 2019-02-13 | 25.795 | 22.819 |
| 2019-02-14 | 25.79 | 22.885 |
| 2019-02-15 | 25.7 | 22.823 |
| 2019-02-18 | 25.715 | 22.703 |
| 2019-02-19 | 25.715 | 22.771 |
| 2019-02-20 | 25.68 | 22.646 |
| 2019-02-21 | 25.645 | 22.586 |
| 2019-02-22 | 25.665 | 22.662 |
| 2019-02-25 | 25.65 | 22.589 |
| 2019-02-26 | 25.665 | 22.594 |
| 2019-02-27 | 25.655 | 22.532 |
| 2019-02-28 | 25.6 | 22.425 |
| 2019-03-01 | 25.635 | 22.52 |
| 2019-03-04 | 25.625 | 22.6 |
| 2019-03-05 | 25.62 | 22.614 |
| 2019-03-06 | 25.595 | 22.641 |
| 2019-03-07 | 25.61 | 22.72 |
| 2019-03-08 | 25.64 | 22.848 |
| 2019-03-11 | 25.655 | 22.818 |
| 2019-03-12 | 25.67 | 22.768 |
| 2019-03-13 | 25.67 | 22.711 |
| 2019-03-14 | 25.67 | 22.724 |
| 2019-03-15 | 25.67 | 22.694 |
| 2019-03-18 | 25.615 | 22.571 |
| 2019-03-19 | 25.6 | 22.537 |
| 2019-03-20 | 25.645 | 22.587 |
| 2019-03-21 | 25.65 | 22.528 |
| 2019-03-22 | 25.725 | 22.761 |
| 2019-03-25 | 25.76 | 22.752 |
| 2019-03-26 | 25.77 | 22.823 |
| 2019-03-27 | 25.8 | 22.912 |
| 2019-03-28 | 25.78 | 22.934 |
| 2019-03-29 | 25.8 | 22.968 |
| 2019-04-01 | 25.79 | 22.955 |
| 2019-04-02 | 25.75 | 22.99 |
| 2019-04-03 | 25.725 | 22.876 |
| 2019-04-04 | 25.695 | 22.91 |
| 2019-04-05 | 25.61 | 22.8 |
| 2019-04-08 | 25.635 | 22.794 |
| 2019-04-09 | 25.62 | 22.716 |
| 2019-04-10 | 25.61 | 22.711 |
| 2019-04-11 | 25.605 | 22.732 |
| 2019-04-12 | 25.62 | 22.633 |
| 2019-04-15 | 25.625 | 22.653 |
| 2019-04-16 | 25.665 | 22.701 |
| 2019-04-17 | 25.655 | 22.702 |
| 2019-04-18 | 25.68 | 22.826 |
| 2019-04-23 | 25.745 | 22.896 |
| 2019-04-24 | 25.73 | 22.95 |
| 2019-04-25 | 25.735 | 23.137 |
| 2019-04-26 | 25.705 | 23.091 |
| 2019-04-29 | 25.68 | 23.028 |
| 2019-04-30 | 25.66 | 22.864 |
| 2019-05-02 | 25.645 | 22.875 |
| 2019-05-03 | 25.715 | 23.055 |
| 2019-05-06 | 25.715 | 22.962 |
| 2019-05-07 | 25.73 | 23.005 |
| 2019-05-09 | 25.72 | 22.983 |
| 2019-05-10 | 25.73 | 22.915 |
| 2019-05-13 | 25.775 | 22.918 |
| 2019-05-14 | 25.75 | 22.942 |
| 2019-05-15 | 25.76 | 23.035 |
| 2019-05-16 | 25.695 | 22.933 |
| 2019-05-17 | 25.75 | 23.048 |
| 2019-05-20 | 25.765 | 23.073 |
| 2019-05-21 | 25.775 | 23.096 |
| 2019-05-22 | 25.79 | 23.089 |
| 2019-05-23 | 25.82 | 23.181 |
| 2019-05-24 | 25.83 | 23.091 |
| 2019-05-27 | 25.835 | 23.074 |
| 2019-05-28 | 25.845 | 23.092 |
| 2019-05-29 | 25.86 | 23.179 |
| 2019-05-30 | 25.84 | 23.208 |
| 2019-05-31 | 25.817 | 23.153 |
| 2019-06-03 | 25.83 | 23.093 |
| 2019-06-04 | 25.745 | 22.906 |
| 2019-06-05 | 25.65 | 22.77 |
| 2019-06-06 | 25.66 | 22.775 |
| 2019-06-07 | 25.64 | 22.745 |
| 2019-06-10 | 25.625 | 22.675 |
| 2019-06-11 | 25.64 | 22.651 |
| 2019-06-12 | 25.615 | 22.623 |
| 2019-06-13 | 25.58 | 22.659 |
| 2019-06-14 | 25.54 | 22.674 |
| 2019-06-17 | 25.56 | 22.752 |
| 2019-06-18 | 25.61 | 22.797 |
| 2019-06-19 | 25.635 | 22.874 |
| 2019-06-20 | 25.62 | 22.663 |
| 2019-06-21 | 25.61 | 22.632 |
| 2019-06-24 | 25.6 | 22.465 |
| 2019-06-25 | 25.555 | 22.438 |
| 2019-06-26 | 25.485 | 22.434 |
| 2019-06-27 | 25.435 | 22.372 |
| 2019-06-28 | 25.445 | 22.363 |
| 2019-07-01 | 25.48 | 22.453 |
| 2019-07-02 | 25.46 | 22.527 |
| 2019-07-03 | 25.455 | 22.535 |
| 2019-07-04 | 25.435 | 22.534 |
| 2019-07-08 | 25.51 | 22.745 |
| 2019-07-09 | 25.545 | 22.8 |
| 2019-07-10 | 25.565 | 22.785 |
| 2019-07-11 | 25.605 | 22.689 |
| 2019-07-12 | 25.59 | 22.742 |
| 2019-07-15 | 25.575 | 22.694 |
| 2019-07-16 | 25.575 | 22.796 |
| 2019-07-17 | 25.605 | 22.829 |
| 2019-07-18 | 25.585 | 22.811 |
| 2019-07-19 | 25.545 | 22.756 |
| 2019-07-22 | 25.535 | 22.771 |
| 2019-07-23 | 25.545 | 22.866 |
| 2019-07-24 | 25.54 | 22.927 |
| 2019-07-25 | 25.52 | 22.961 |
| 2019-07-26 | 25.54 | 22.932 |
| 2019-07-29 | 25.61 | 23.033 |
| 2019-07-30 | 25.65 | 22.996 |
| 2019-07-31 | 25.66 | 23.014 |
| 2019-08-01 | 25.74 | 23.326 |
| 2019-08-02 | 25.765 | 23.199 |
| 2019-08-05 | 25.775 | 23.052 |
| 2019-08-06 | 25.725 | 22.999 |
| 2019-08-07 | 25.72 | 22.96 |
| 2019-08-08 | 25.79 | 23.041 |
| 2019-08-09 | 25.83 | 23.068 |
| 2019-08-12 | 25.83 | 23.074 |
| 2019-08-13 | 25.83 | 23.019 |
| 2019-08-14 | 25.885 | 23.135 |
| 2019-08-15 | 25.88 | 23.211 |
| 2019-08-16 | 25.735 | 23.236 |
| 2019-08-19 | 25.78 | 23.219 |
| 2019-08-20 | 25.795 | 23.289 |
| 2019-08-21 | 25.795 | 23.231 |
| 2019-08-22 | 25.785 | 23.261 |
| 2019-08-23 | 25.765 | 23.274 |
| 2019-08-26 | 25.79 | 23.199 |
| 2019-08-27 | 25.815 | 23.252 |
| 2019-08-28 | 25.845 | 23.322 |
| 2019-08-29 | 25.85 | 23.344 |
| 2019-08-30 | 25.915 | 23.484 |
| 2019-09-02 | 25.92 | 23.632 |
| 2019-09-03 | 25.885 | 23.665 |
| 2019-09-04 | 25.835 | 23.444 |
| 2019-09-05 | 25.85 | 23.379 |
| 2019-09-06 | 25.835 | 23.424 |
| 2019-09-09 | 25.855 | 23.431 |
| 2019-09-10 | 25.865 | 23.431 |
| 2019-09-11 | 25.865 | 23.507 |
| 2019-09-12 | 25.83 | 23.565 |
| 2019-09-13 | 25.845 | 23.286 |
| 2019-09-16 | 25.88 | 23.461 |
| 2019-09-17 | 25.915 | 23.499 |
| 2019-09-18 | 25.89 | 23.424 |
| 2019-09-19 | 25.895 | 23.398 |
| 2019-09-20 | 25.91 | 23.49 |
| 2019-09-23 | 25.89 | 23.567 |
| 2019-09-24 | 25.87 | 23.514 |
| 2019-09-25 | 25.86 | 23.55 |
| 2019-09-26 | 25.85 | 23.636 |
| 2019-09-27 | 25.84 | 23.633 |
| 2019-09-30 | 25.815 | 23.707 |
| 2019-10-01 | 25.74 | 23.618 |
| 2019-10-02 | 25.74 | 23.561 |
| 2019-10-03 | 25.74 | 23.506 |
| 2019-10-04 | 25.74 | 23.444 |
| 2019-10-07 | 25.78 | 23.451 |
| 2019-10-08 | 25.805 | 23.488 |
| 2019-10-09 | 25.825 | 23.518 |
| 2019-10-10 | 25.89 | 23.476 |
| 2019-10-11 | 25.81 | 23.372 |
| 2019-10-14 | 25.825 | 23.411 |
| 2019-10-15 | 25.82 | 23.458 |
| 2019-10-16 | 25.76 | 23.365 |
| 2019-10-17 | 25.67 | 23.107 |
| 2019-10-18 | 25.66 | 23.026 |
| 2019-10-21 | 25.63 | 22.94 |
| 2019-10-22 | 25.575 | 22.974 |
| 2019-10-23 | 25.635 | 23.051 |
| 2019-10-24 | 25.595 | 23.003 |
| 2019-10-25 | 25.57 | 23.022 |
| 2019-10-29 | 25.545 | 23.022 |
| 2019-10-30 | 25.51 | 22.969 |
| 2019-10-31 | 25.51 | 22.871 |
| 2019-11-01 | 25.515 | 22.906 |
| 2019-11-04 | 25.515 | 22.866 |
| 2019-11-05 | 25.535 | 22.984 |
| 2019-11-06 | 25.5 | 22.98 |
| 2019-11-07 | 25.53 | 23.048 |
| 2019-11-08 | 25.485 | 23.099 |
| 2019-11-11 | 25.51 | 23.103 |
| 2019-11-12 | 25.5 | 23.152 |
| 2019-11-13 | 25.59 | 23.247 |
| 2019-11-14 | 25.56 | 23.232 |
| 2019-11-15 | 25.58 | 23.185 |
| 2019-11-18 | 25.59 | 23.135 |
| 2019-11-19 | 25.565 | 23.081 |
| 2019-11-20 | 25.535 | 23.099 |
| 2019-11-21 | 25.52 | 23.01 |
| 2019-11-22 | 25.51 | 23.069 |
| 2019-11-25 | 25.485 | 23.151 |
| 2019-11-26 | 25.505 | 23.145 |
| 2019-11-27 | 25.515 | 23.176 |
| 2019-11-28 | 25.575 | 23.24 |
| 2019-11-29 | 25.515 | 23.233 |
| 2019-12-02 | 25.535 | 23.166 |
| 2019-12-03 | 25.525 | 23.056 |
| 2019-12-04 | 25.52 | 23.016 |
| 2019-12-05 | 25.525 | 23.009 |
| 2019-12-06 | 25.535 | 23.017 |
| 2019-12-09 | 25.525 | 23.047 |
| 2019-12-10 | 25.525 | 23.043 |
| 2019-12-11 | 25.52 | 23.042 |
| 2019-12-12 | 25.52 | 22.915 |
| 2019-12-13 | 25.51 | 22.831 |
| 2019-12-16 | 25.485 | 22.863 |
| 2019-12-17 | 25.45 | 22.801 |
| 2019-12-18 | 25.49 | 22.933 |
| 2019-12-19 | 25.475 | 22.915 |
| 2019-12-20 | 25.445 | 22.937 |
| 2019-12-23 | 25.5 | 23.025 |
| 2019-12-27 | 25.51 | 22.873 |
| 2019-12-30 | 25.46 | 22.757 |
| 2019-12-31 | 25.41 | 22.621 |
| 2020-01-02 | 25.41 | 22.702 |
| 2020-01-03 | 25.36 | 22.753 |
| 2020-01-06 | 25.3 | 22.601 |
| 2020-01-07 | 25.275 | 22.626 |
| 2020-01-08 | 25.265 | 22.739 |
| 2020-01-09 | 25.255 | 22.733 |
| 2020-01-10 | 25.265 | 22.78 |
| 2020-01-13 | 25.23 | 22.677 |
| 2020-01-14 | 25.155 | 22.634 |
| 2020-01-15 | 25.145 | 22.567 |
| 2020-01-16 | 25.17 | 22.538 |
| 2020-01-17 | 25.145 | 22.638 |
| 2020-01-20 | 25.125 | 22.667 |
| 2020-01-21 | 25.065 | 22.552 |
| 2020-01-22 | 25.135 | 22.668 |
| 2020-01-23 | 25.16 | 22.686 |
| 2020-01-24 | 25.16 | 22.798 |
| 2020-01-27 | 25.23 | 22.883 |
| 2020-01-28 | 25.22 | 22.916 |
| 2020-01-29 | 25.205 | 22.913 |
| 2020-01-30 | 25.25 | 22.894 |
| 2020-01-31 | 25.21 | 22.81 |
| 2020-02-03 | 25.175 | 22.75 |
| 2020-02-04 | 25.145 | 22.761 |
| 2020-02-05 | 25.05 | 22.732 |
| 2020-02-06 | 24.895 | 22.627 |
| 2020-02-07 | 25.03 | 22.817 |
| 2020-02-10 | 25.025 | 22.851 |
| 2020-02-11 | 24.965 | 22.897 |
| 2020-02-12 | 24.875 | 22.792 |
| 2020-02-13 | 24.835 | 22.851 |
| 2020-02-14 | 24.825 | 22.897 |
| 2020-02-17 | 24.795 | 22.883 |
| 2020-02-18 | 24.9 | 23.023 |
| 2020-02-19 | 24.96 | 23.113 |
| 2020-02-20 | 25.035 | 23.205 |
| 2020-02-21 | 25.06 | 23.206 |
| 2020-02-24 | 25.19 | 23.284 |
| 2020-02-25 | 25.225 | 23.269 |
| 2020-02-26 | 25.345 | 23.308 |
| 2020-02-27 | 25.285 | 23.062 |
| 2020-02-28 | 25.39 | 23.124 |
| 2020-03-02 | 25.525 | 22.952 |
| 2020-03-03 | 25.475 | 22.919 |
| 2020-03-04 | 25.34 | 22.779 |
| 2020-03-05 | 25.355 | 22.665 |
| 2020-03-06 | 25.46 | 22.459 |
| 2020-03-09 | 25.505 | 22.265 |
| 2020-03-10 | 25.715 | 22.57 |
| 2020-03-11 | 25.77 | 22.737 |
| 2020-03-12 | 26.2 | 23.31 |
| 2020-03-13 | 26.04 | 23.449 |
| 2020-03-16 | 26.96 | 24.169 |
| 2020-03-17 | 26.98 | 24.569 |
| 2020-03-18 | 27.16 | 24.834 |
| 2020-03-19 | 27.605 | 25.567 |
| 2020-03-20 | 27.19 | 25.406 |
| 2020-03-23 | 27.635 | 25.629 |
| 2020-03-24 | 27.81 | 25.648 |
| 2020-03-25 | 27.44 | 25.351 |
| 2020-03-26 | 27.55 | 25.084 |
| 2020-03-27 | 27.3 | 24.879 |
| 2020-03-30 | 27.315 | 24.759 |
| 2020-03-31 | 27.325 | 24.943 |
| 2020-04-01 | 27.38 | 25.039 |
| 2020-04-02 | 27.555 | 25.287 |
| 2020-04-03 | 27.54 | 25.535 |
| 2020-04-06 | 27.595 | 25.567 |
| 2020-04-07 | 27.215 | 24.995 |
| 2020-04-08 | 27.2 | 25.021 |
| 2020-04-09 | 26.905 | 24.758 |
| 2020-04-14 | 26.855 | 24.494 |
| 2020-04-15 | 26.99 | 24.751 |
| 2020-04-16 | 27.055 | 24.85 |
| 2020-04-17 | 27.165 | 25.009 |
| 2020-04-20 | 27.325 | 25.163 |
| 2020-04-21 | 27.45 | 25.33 |
| 2020-04-22 | 27.53 | 25.334 |
| 2020-04-23 | 27.55 | 25.573 |
| 2020-04-24 | 27.31 | 25.292 |
| 2020-04-27 | 27.185 | 25.05 |
| 2020-04-28 | 27.225 | 25.036 |
| 2020-04-29 | 27.125 | 25.018 |
| 2020-04-30 | 27.095 | 24.915 |
| 2020-05-04 | 27.12 | 24.785 |
| 2020-05-05 | 26.985 | 24.888 |
| 2020-05-06 | 26.985 | 24.971 |
| 2020-05-07 | 27.145 | 25.181 |
| 2020-05-11 | 27.595 | 25.498 |
| 2020-05-12 | 27.42 | 25.254 |
| 2020-05-13 | 27.41 | 25.206 |
| 2020-05-14 | 27.57 | 25.551 |
| 2020-05-15 | 27.59 | 25.553 |
| 2020-05-18 | 27.61 | 25.483 |
| 2020-05-19 | 27.49 | 25.106 |
| 2020-05-20 | 27.43 | 25.032 |
| 2020-05-21 | 27.215 | 24.741 |
| 2020-05-22 | 27.21 | 24.953 |
| 2020-05-25 | 27.275 | 25.003 |
| 2020-05-26 | 27.07 | 24.661 |
| 2020-05-27 | 27.05 | 24.609 |
| 2020-05-28 | 27.015 | 24.521 |
| 2020-05-29 | 26.915 | 24.168 |
| 2020-06-01 | 26.86 | 24.163 |
| 2020-06-02 | 26.65 | 23.85 |
| 2020-06-03 | 26.66 | 23.815 |
| 2020-06-04 | 26.62 | 23.66 |
| 2020-06-05 | 26.59 | 23.469 |
| 2020-06-08 | 26.585 | 23.555 |
| 2020-06-09 | 26.635 | 23.59 |
| 2020-06-10 | 26.61 | 23.39 |
| 2020-06-11 | 26.675 | 23.505 |
| 2020-06-12 | 26.68 | 23.601 |
| 2020-06-15 | 26.68 | 23.71 |
| 2020-06-16 | 26.57 | 23.498 |
| 2020-06-17 | 26.56 | 23.647 |
| 2020-06-18 | 26.69 | 23.786 |
| 2020-06-19 | 26.685 | 23.806 |
| 2020-06-22 | 26.665 | 23.777 |
| 2020-06-23 | 26.61 | 23.509 |
| 2020-06-24 | 26.735 | 23.701 |
| 2020-06-25 | 26.795 | 23.926 |
| 2020-06-26 | 26.805 | 23.908 |
| 2020-06-29 | 26.85 | 23.797 |
| 2020-06-30 | 26.74 | 23.879 |
| 2020-07-01 | 26.67 | 23.81 |
| 2020-07-02 | 26.625 | 23.59 |
| 2020-07-03 | 26.665 | 23.757 |
| 2020-07-07 | 26.68 | 23.63 |
| 2020-07-08 | 26.745 | 23.698 |
| 2020-07-09 | 26.62 | 23.474 |
| 2020-07-10 | 26.69 | 23.672 |
| 2020-07-13 | 26.645 | 23.52 |
| 2020-07-14 | 26.635 | 23.411 |
| 2020-07-15 | 26.59 | 23.235 |
| 2020-07-16 | 26.69 | 23.385 |
| 2020-07-17 | 26.685 | 23.351 |
| 2020-07-20 | 26.6 | 23.233 |
| 2020-07-21 | 26.43 | 23.097 |
| 2020-07-22 | 26.365 | 22.77 |
| 2020-07-23 | 26.34 | 22.766 |
| 2020-07-24 | 26.265 | 22.625 |
| 2020-07-27 | 26.195 | 22.28 |
| 2020-07-28 | 26.255 | 22.407 |
| 2020-07-29 | 26.29 | 22.424 |
| 2020-07-30 | 26.25 | 22.352 |
| 2020-07-31 | 26.175 | 22.091 |
| 2020-08-03 | 26.32 | 22.451 |
| 2020-08-04 | 26.22 | 22.287 |
| 2020-08-05 | 26.09 | 21.992 |
| 2020-08-06 | 26.2 | 22.125 |
| 2020-08-07 | 26.28 | 22.241 |
| 2020-08-10 | 26.185 | 22.262 |
| 2020-08-11 | 26.155 | 22.194 |
| 2020-08-12 | 26.115 | 22.185 |
| 2020-08-13 | 26.125 | 22.082 |
| 2020-08-14 | 26.115 | 22.105 |
| 2020-08-17 | 26.14 | 22.053 |
| 2020-08-18 | 26.135 | 21.949 |
| 2020-08-19 | 26.115 | 21.88 |
| 2020-08-20 | 26.06 | 21.992 |
| 2020-08-21 | 26.085 | 22.168 |
| 2020-08-24 | 26.09 | 22.023 |
| 2020-08-25 | 26.12 | 22.109 |
| 2020-08-26 | 26.26 | 22.272 |
| 2020-08-27 | 26.27 | 22.258 |
| 2020-08-28 | 26.2 | 21.989 |
| 2020-08-31 | 26.21 | 21.953 |
| 2020-09-01 | 26.225 | 21.882 |
| 2020-09-02 | 26.34 | 22.203 |
| 2020-09-03 | 26.37 | 22.325 |
| 2020-09-04 | 26.435 | 22.323 |
| 2020-09-07 | 26.47 | 22.386 |
| 2020-09-08 | 26.52 | 22.503 |
| 2020-09-09 | 26.52 | 22.532 |
| 2020-09-10 | 26.585 | 22.436 |
| 2020-09-11 | 26.57 | 22.411 |
| 2020-09-14 | 26.66 | 22.449 |
| 2020-09-15 | 26.83 | 22.564 |
| 2020-09-16 | 26.715 | 22.503 |
| 2020-09-17 | 26.74 | 22.669 |
| 2020-09-18 | 26.725 | 22.585 |
| 2020-09-21 | 26.99 | 22.897 |
| 2020-09-22 | 27.01 | 23.008 |
| 2020-09-23 | 26.96 | 23.055 |
| 2020-09-24 | 27.015 | 23.197 |
| 2020-09-25 | 27.105 | 23.294 |
| 2020-09-29 | 27.15 | 23.203 |
| 2020-09-30 | 27.21 | 23.239 |
| 2020-10-01 | 26.905 | 22.895 |
| 2020-10-02 | 27.03 | 23.043 |
| 2020-10-05 | 27.095 | 23.023 |
| 2020-10-06 | 27.03 | 22.917 |
| 2020-10-07 | 27.065 | 22.996 |
| 2020-10-08 | 27.09 | 23.029 |
| 2020-10-09 | 27.11 | 22.983 |
| 2020-10-12 | 27.175 | 23.029 |
| 2020-10-13 | 27.36 | 23.212 |
| 2020-10-14 | 27.31 | 23.244 |
| 2020-10-15 | 27.34 | 23.375 |
| 2020-10-16 | 27.275 | 23.232 |
| 2020-10-19 | 27.345 | 23.204 |
| 2020-10-20 | 27.235 | 23.064 |
| 2020-10-21 | 27.185 | 22.937 |
| 2020-10-22 | 27.23 | 23.035 |
| 2020-10-23 | 27.22 | 22.961 |
| 2020-10-26 | 27.295 | 23.091 |
| 2020-10-27 | 27.34 | 23.109 |
| 2020-10-29 | 27.365 | 23.381 |
| 2020-10-30 | 27.25 | 23.296 |